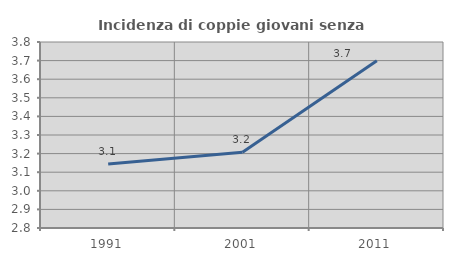
| Category | Incidenza di coppie giovani senza figli |
|---|---|
| 1991.0 | 3.144 |
| 2001.0 | 3.207 |
| 2011.0 | 3.699 |